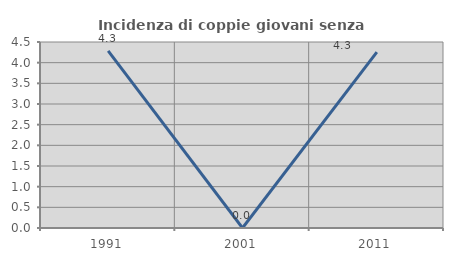
| Category | Incidenza di coppie giovani senza figli |
|---|---|
| 1991.0 | 4.286 |
| 2001.0 | 0 |
| 2011.0 | 4.255 |